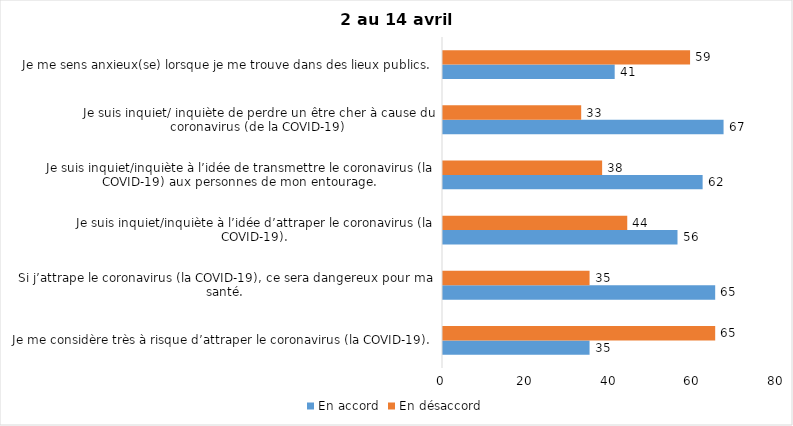
| Category | En accord | En désaccord |
|---|---|---|
| Je me considère très à risque d’attraper le coronavirus (la COVID-19). | 35 | 65 |
| Si j’attrape le coronavirus (la COVID-19), ce sera dangereux pour ma santé. | 65 | 35 |
| Je suis inquiet/inquiète à l’idée d’attraper le coronavirus (la COVID-19). | 56 | 44 |
| Je suis inquiet/inquiète à l’idée de transmettre le coronavirus (la COVID-19) aux personnes de mon entourage. | 62 | 38 |
| Je suis inquiet/ inquiète de perdre un être cher à cause du coronavirus (de la COVID-19) | 67 | 33 |
| Je me sens anxieux(se) lorsque je me trouve dans des lieux publics. | 41 | 59 |